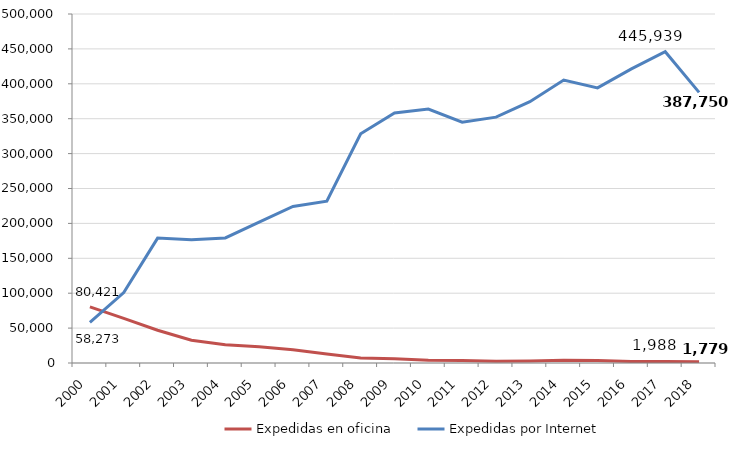
| Category | Expedidas en oficina | Expedidas por Internet |
|---|---|---|
| 2000.0 | 80421 | 58273 |
| 2001.0 | 64042 | 100869 |
| 2002.0 | 46964 | 178952 |
| 2003.0 | 32720 | 176407 |
| 2004.0 | 26096 | 179107 |
| 2005.0 | 23372 | 201707 |
| 2006.0 | 19115 | 224257 |
| 2007.0 | 12845 | 231868 |
| 2008.0 | 7134 | 328456 |
| 2009.0 | 6070 | 358211 |
| 2010.0 | 3978 | 363757 |
| 2011.0 | 3529 | 344978 |
| 2012.0 | 2560 | 352242 |
| 2013.0 | 2858 | 374439 |
| 2014.0 | 3882 | 405297 |
| 2015.0 | 3470 | 394167 |
| 2016.0 | 2312 | 421304 |
| 2017.0 | 1988 | 445939 |
| 2018.0 | 1779 | 387750 |